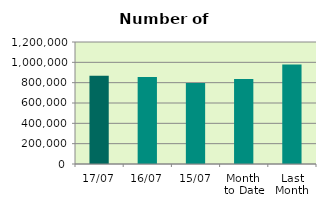
| Category | Series 0 |
|---|---|
| 17/07 | 869172 |
| 16/07 | 856714 |
| 15/07 | 796648 |
| Month 
to Date | 835472 |
| Last
Month | 977938.2 |